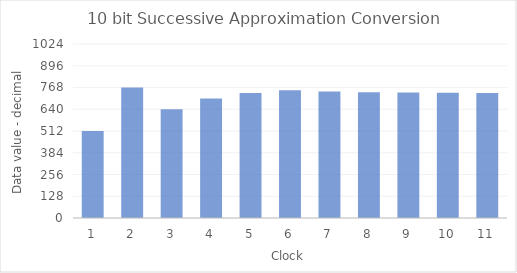
| Category |  value N |
|---|---|
| 1.0 | 512 |
| 2.0 | 768 |
| 3.0 | 640 |
| 4.0 | 704 |
| 5.0 | 736 |
| 6.0 | 752 |
| 7.0 | 744 |
| 8.0 | 740 |
| 9.0 | 738 |
| 10.0 | 737 |
| 11.0 | 736 |